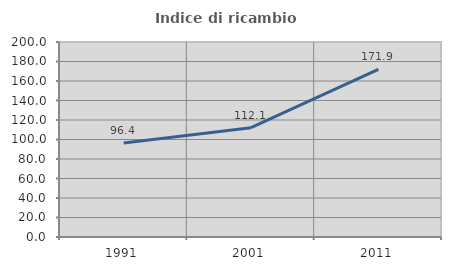
| Category | Indice di ricambio occupazionale  |
|---|---|
| 1991.0 | 96.429 |
| 2001.0 | 112.121 |
| 2011.0 | 171.875 |